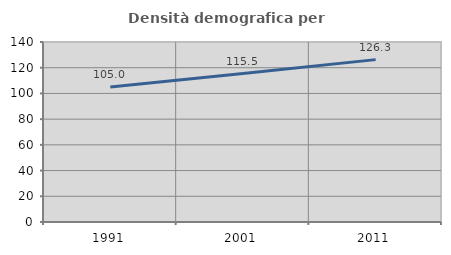
| Category | Densità demografica |
|---|---|
| 1991.0 | 104.952 |
| 2001.0 | 115.465 |
| 2011.0 | 126.291 |